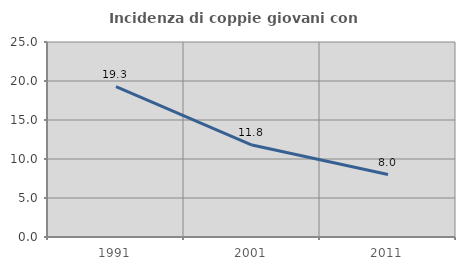
| Category | Incidenza di coppie giovani con figli |
|---|---|
| 1991.0 | 19.265 |
| 2001.0 | 11.788 |
| 2011.0 | 8.007 |